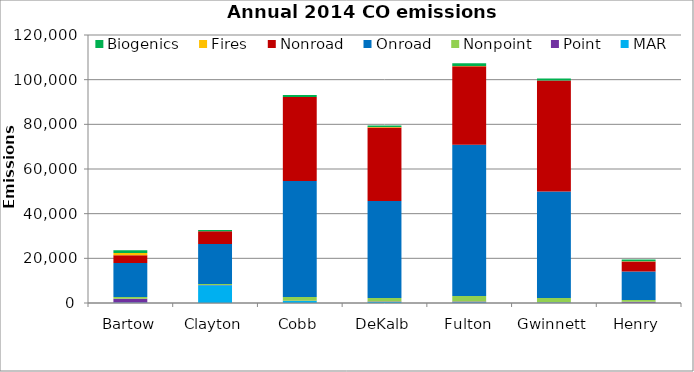
| Category | MAR | Point | Nonpoint | Onroad | Nonroad | Fires | Biogenics |
|---|---|---|---|---|---|---|---|
| Bartow | 196.175 | 1662.61 | 779.633 | 15231.118 | 3463.073 | 1015.526 | 1291.478 |
| Clayton | 7991.911 | 56.09 | 489.135 | 17879.987 | 5669.186 | 43.41 | 525.031 |
| Cobb | 860.588 | 181.61 | 1675.068 | 51926.807 | 37614.681 | 0.112 | 920.987 |
| DeKalb | 436.353 | 269.23 | 1495.635 | 43442.616 | 32970.734 | 143.961 | 747.635 |
| Fulton | 317.883 | 302.54 | 2472.606 | 67802.909 | 35086.555 | 148.492 | 1235.259 |
| Gwinnett | 256.102 | 130.89 | 1832.697 | 47730.65 | 49629.918 | 7.776 | 939.215 |
| Henry | 88.405 | 505.31 | 764.388 | 12718.041 | 4510.052 | 115.692 | 825.853 |